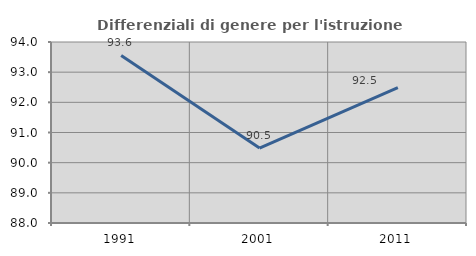
| Category | Differenziali di genere per l'istruzione superiore |
|---|---|
| 1991.0 | 93.554 |
| 2001.0 | 90.485 |
| 2011.0 | 92.486 |